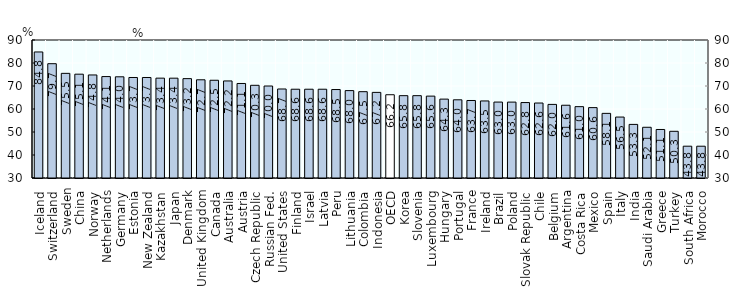
| Category | ER 2015 Q3 |
|---|---|
| Iceland  | 84.8 |
| Switzerland  | 79.7 |
| Sweden | 75.5 |
| China  | 75.141 |
| Norway  | 74.8 |
| Netherlands  | 74.1 |
| Germany  | 74 |
| Estonia  | 73.7 |
| New Zealand  | 73.7 |
| Kazakhstan  | 73.413 |
| Japan  | 73.4 |
| Denmark  | 73.2 |
| United Kingdom  | 72.7 |
| Canada  | 72.5 |
| Australia  | 72.2 |
| Austria  | 71.1 |
| Czech Republic  | 70.3 |
| Russian Fed.  | 70 |
| United States  | 68.7 |
| Finland  | 68.6 |
| Israel  | 68.6 |
| Latvia  | 68.6 |
| Peru  | 68.46 |
| Lithuania  | 68 |
| Colombia  | 67.533 |
| Indonesia  | 67.228 |
| OECD  | 66.2 |
| Korea  | 65.8 |
| Slovenia  | 65.8 |
| Luxembourg  | 65.6 |
| Hungary  | 64.3 |
| Portugal  | 64 |
| France  | 63.7 |
| Ireland  | 63.5 |
| Brazil  | 63.015 |
| Poland  | 63 |
| Slovak Republic  | 62.8 |
| Chile  | 62.6 |
| Belgium  | 62 |
| Argentina  | 61.635 |
| Costa Rica  | 61.026 |
| Mexico  | 60.6 |
| Spain  | 58.1 |
| Italy  | 56.5 |
| India  | 53.305 |
| Saudi Arabia  | 52.058 |
| Greece  | 51.1 |
| Turkey  | 50.3 |
| South Africa  | 43.83 |
| Morocco  | 43.824 |